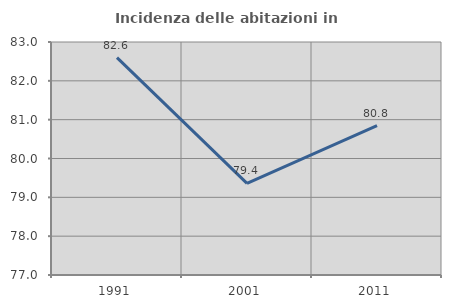
| Category | Incidenza delle abitazioni in proprietà  |
|---|---|
| 1991.0 | 82.598 |
| 2001.0 | 79.358 |
| 2011.0 | 80.847 |